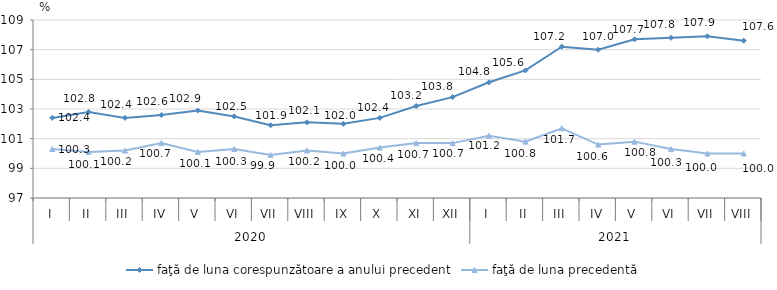
| Category | faţă de luna corespunzătoare a anului precedent | faţă de luna precedentă   |
|---|---|---|
| 0 | 102.4 | 100.3 |
| 1 | 102.8 | 100.1 |
| 2 | 102.4 | 100.2 |
| 3 | 102.6 | 100.7 |
| 4 | 102.9 | 100.1 |
| 5 | 102.5 | 100.3 |
| 6 | 101.9 | 99.9 |
| 7 | 102.1 | 100.2 |
| 8 | 102 | 100 |
| 9 | 102.4 | 100.4 |
| 10 | 103.2 | 100.7 |
| 11 | 103.8 | 100.7 |
| 12 | 104.8 | 101.2 |
| 13 | 105.6 | 100.8 |
| 14 | 107.2 | 101.7 |
| 15 | 107 | 100.6 |
| 16 | 107.7 | 100.8 |
| 17 | 107.8 | 100.3 |
| 18 | 107.9 | 100 |
| 19 | 107.6 | 100 |